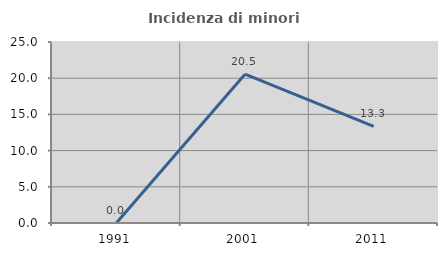
| Category | Incidenza di minori stranieri |
|---|---|
| 1991.0 | 0 |
| 2001.0 | 20.548 |
| 2011.0 | 13.333 |